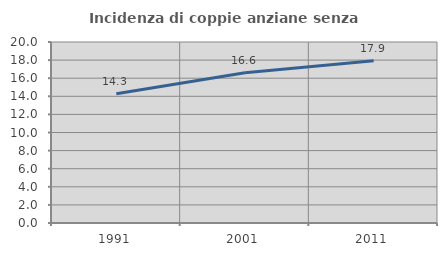
| Category | Incidenza di coppie anziane senza figli  |
|---|---|
| 1991.0 | 14.286 |
| 2001.0 | 16.593 |
| 2011.0 | 17.931 |